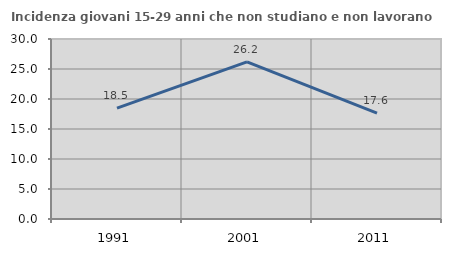
| Category | Incidenza giovani 15-29 anni che non studiano e non lavorano  |
|---|---|
| 1991.0 | 18.475 |
| 2001.0 | 26.19 |
| 2011.0 | 17.636 |